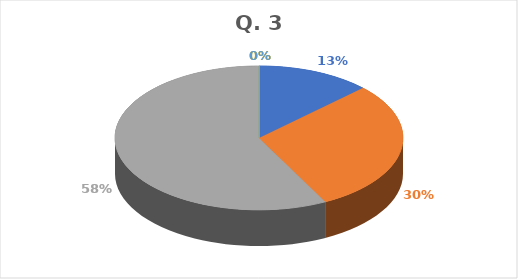
| Category | Series 0 |
|---|---|
| Excellent  | 16 |
| Very Good | 37 |
| Good | 72 |
| Average | 0 |
| Below Average | 0 |